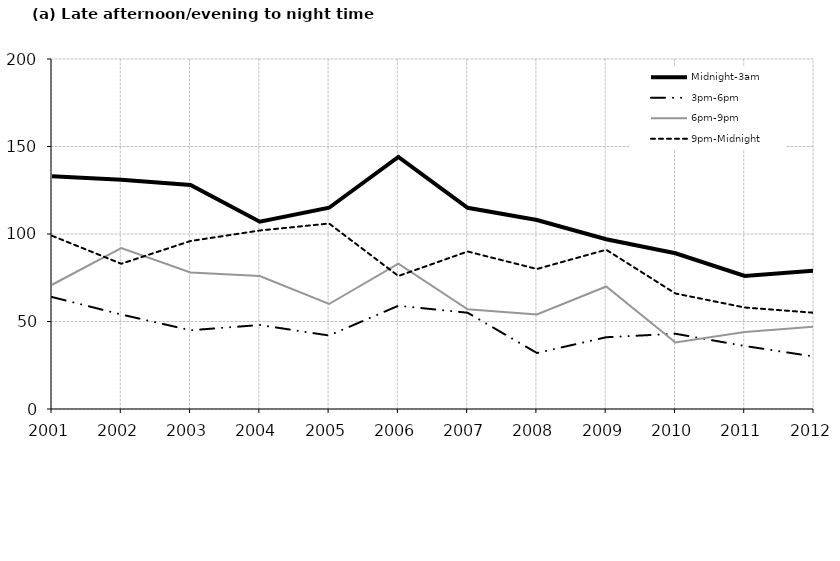
| Category | Midnight-3am | 3pm-6pm | 6pm-9pm | 9pm-Midnight |
|---|---|---|---|---|
| 2001.0 | 133 | 64 | 71 | 99 |
| 2002.0 | 131 | 54 | 92 | 83 |
| 2003.0 | 128 | 45 | 78 | 96 |
| 2004.0 | 107 | 48 | 76 | 102 |
| 2005.0 | 115 | 42 | 60 | 106 |
| 2006.0 | 144 | 59 | 83 | 76 |
| 2007.0 | 115 | 55 | 57 | 90 |
| 2008.0 | 108 | 32 | 54 | 80 |
| 2009.0 | 97 | 41 | 70 | 91 |
| 2010.0 | 89 | 43 | 38 | 66 |
| 2011.0 | 76 | 36 | 44 | 58 |
| 2012.0 | 79 | 30 | 47 | 55 |